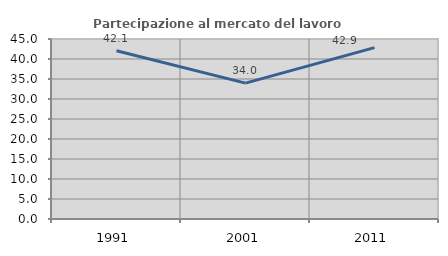
| Category | Partecipazione al mercato del lavoro  femminile |
|---|---|
| 1991.0 | 42.056 |
| 2001.0 | 33.962 |
| 2011.0 | 42.857 |